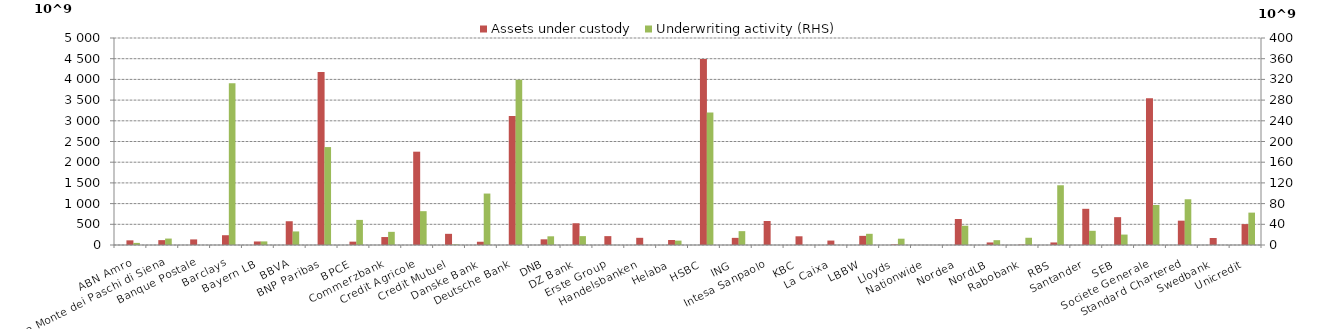
| Category | Assets under custody |
|---|---|
| ABN Amro | 112395.912 |
| Banca Monte dei Paschi di Siena | 117544.511 |
| Banque Postale | 135100 |
| Barclays | 236255.743 |
| Bayern LB | 85168.14 |
| BBVA | 573882.175 |
| BNP Paribas | 4181078.261 |
| BPCE | 80900 |
| Commerzbank | 192435.522 |
| Credit Agricole | 2254000 |
| Credit Mutuel | 269863 |
| Danske Bank | 78650.142 |
| Deutsche Bank | 3114659.952 |
| DNB | 137390.888 |
| DZ Bank | 525145.299 |
| Erste Group | 214340 |
| Handelsbanken | 173606.799 |
| Helaba | 120200 |
| HSBC | 4491000.712 |
| ING | 172406 |
| Intesa Sanpaolo | 579084 |
| KBC | 210419.52 |
| La Caixa | 107207.714 |
| LBBW | 220710.542 |
| Lloyds | 12206.367 |
| Nationwide | 0 |
| Nordea | 627942 |
| NordLB | 61635.539 |
| Rabobank | 8237 |
| RBS | 61517.332 |
| Santander | 874230.268 |
| SEB | 672528.81 |
| Societe Generale | 3545000 |
| Standard Chartered | 587922.473 |
| Swedbank | 169762.103 |
| Unicredit | 504908.152 |